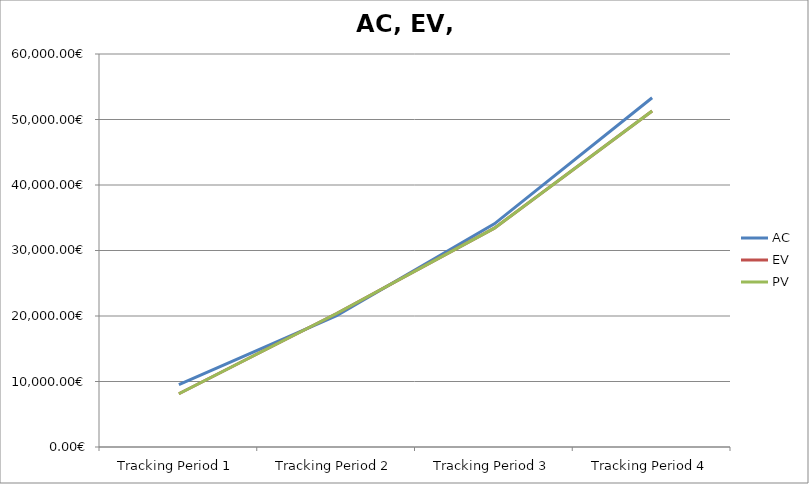
| Category | AC | EV | PV |
|---|---|---|---|
| Tracking Period 1 | 9505.82 | 8126.82 | 8126.82 |
| Tracking Period 2 | 20056.33 | 20387.33 | 20387.33 |
| Tracking Period 3 | 34075.84 | 33416.84 | 33416.84 |
| Tracking Period 4 | 53319.24 | 51286.24 | 51286.24 |